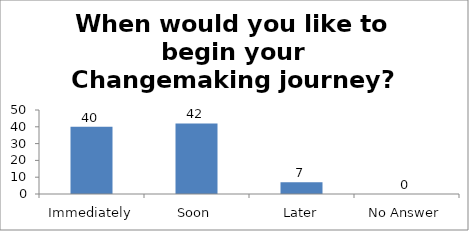
| Category | When would you like to begin your Changemaking journey?  |
|---|---|
| Immediately | 40 |
| Soon | 42 |
| Later | 7 |
| No Answer | 0 |